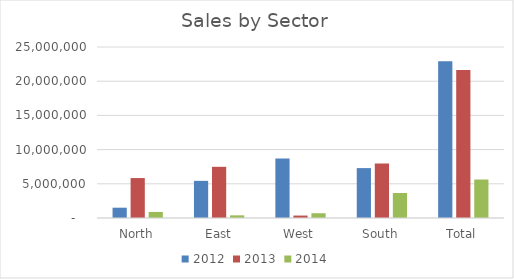
| Category | 2012 | 2013 | 2014 |
|---|---|---|---|
| North | 1505779 | 5839826 | 885246 |
| East | 5431701 | 7484248 | 388309 |
| West | 8697805 | 356976 | 695638 |
| South | 7294899 | 7968289 | 3655180 |
| Total | 22932196 | 21651352 | 5626387 |